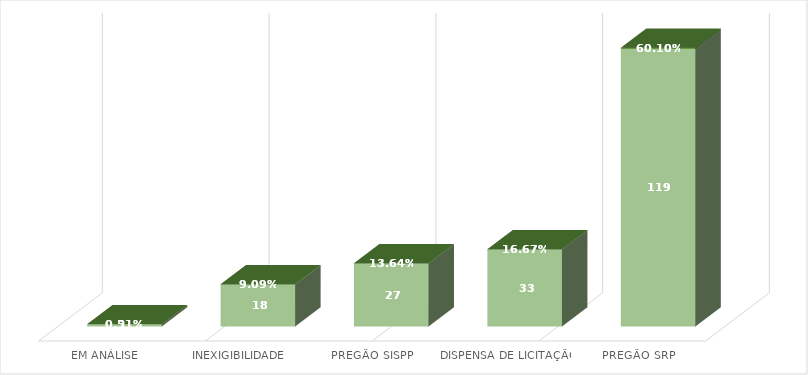
| Category | Contagem de Pedido nº | Contagem de Pedido nº2 |
|---|---|---|
| EM ANÁLISE | 1 | 0.005 |
| INEXIGIBILIDADE | 18 | 0.091 |
| PREGÃO SISPP | 27 | 0.136 |
| DISPENSA DE LICITAÇÃO | 33 | 0.167 |
| PREGÃO SRP | 119 | 0.601 |